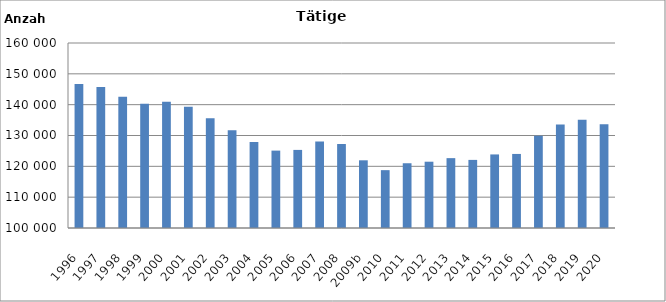
| Category | Series 0 |
|---|---|
| 1996 | 146742 |
| 1997 | 145717 |
| 1998 | 142598 |
| 1999 | 140319 |
| 2000 | 140983 |
| 2001 | 139341 |
| 2002 | 135596 |
| 2003 | 131743 |
| 2004 | 127904 |
| 2005 | 125099 |
| 2006 | 125327 |
| 2007 | 128030 |
| 2008 | 127238 |
| 2009b | 121954 |
| 2010 | 118762 |
| 2011 | 121003 |
| 2012 | 121500 |
| 2013 | 122658 |
| 2014 | 122086 |
| 2015 | 123861 |
| 2016 | 124018 |
| 2017 | 129935 |
| 2018 | 133536 |
| 2019 | 135140 |
| 2020 | 133658 |